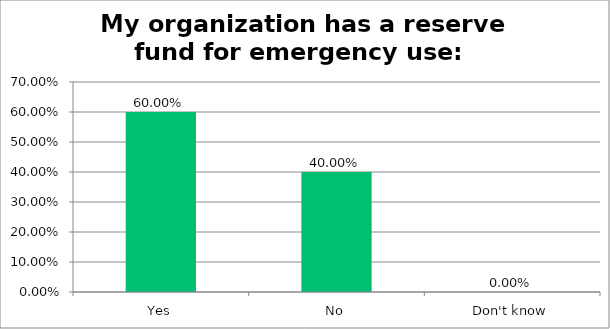
| Category | Responses |
|---|---|
| Yes | 0.6 |
| No | 0.4 |
| Don't know | 0 |